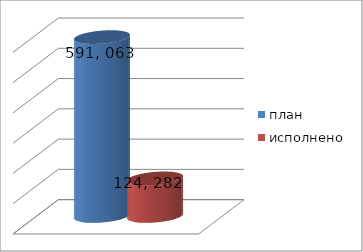
| Category | план | исполнено |
|---|---|---|
| 0 | 591063090 | 124282269.5 |